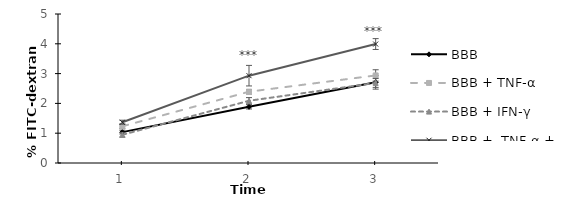
| Category | BBB | BBB + TNF-α | BBB + IFN-γ | BBB +  TNF-α + IFN-γ |
|---|---|---|---|---|
| 0 | 1.036 | 1.231 | 0.946 | 1.368 |
| 1 | 1.885 | 2.392 | 2.088 | 2.93 |
| 2 | 2.707 | 2.938 | 2.687 | 3.992 |